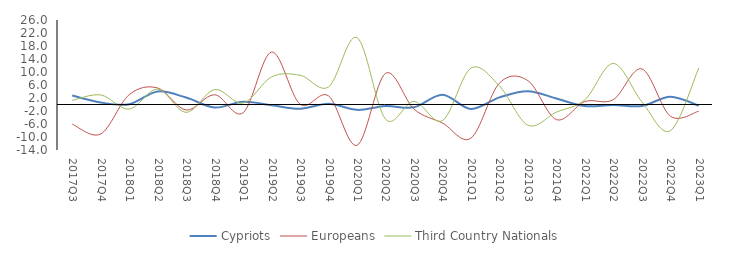
| Category | Cypriots | Europeans | Third Country Nationals |
|---|---|---|---|
| 2017Q3 | 2.76 | -6.051 | 1.245 |
| 2017Q4 | 0.611 | -9.065 | 2.94 |
| 2018Q1 | 0.102 | 3.027 | -1.426 |
| 2018Q2 | 4.023 | 5.079 | 4.742 |
| 2018Q3 | 2.13 | -1.698 | -2.439 |
| 2018Q4 | -0.92 | 3.002 | 4.61 |
| 2019Q1 | 0.847 | -2.551 | 0.424 |
| 2019Q2 | -0.212 | 16.147 | 8.492 |
| 2019Q3 | -1.307 | 0.095 | 9.007 |
| 2019Q4 | 0.246 | 2.642 | 5.414 |
| 2020Q1 | -1.648 | -12.551 | 20.599 |
| 2020Q2 | -0.459 | 9.585 | -4.501 |
| 2020Q3 | -0.868 | -1.397 | 0.948 |
| 2020Q4 | 3.026 | -5.709 | -4.94 |
| 2021Q1 | -1.383 | -10.349 | 11.181 |
| 2021Q2 | 2.188 | 6.564 | 5.695 |
| 2021Q3 | 4.07 | 7.34 | -6.362 |
| 2021Q4 | 1.853 | -4.645 | -2.354 |
| 2022Q1 | -0.481 | 0.899 | 1.427 |
| 2022Q2 | -0.126 | 1.492 | 12.634 |
| 2022Q3 | -0.463 | 10.962 | 0.885 |
| 2022Q4 | 2.39 | -3.557 | -8.097 |
| 2023Q1 | -0.362 | -2.064 | 11.229 |